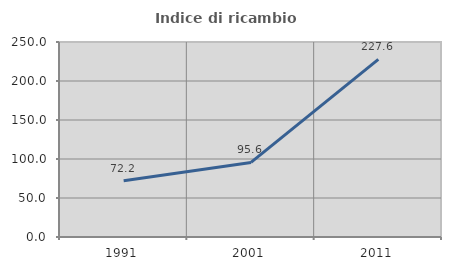
| Category | Indice di ricambio occupazionale  |
|---|---|
| 1991.0 | 72.183 |
| 2001.0 | 95.616 |
| 2011.0 | 227.619 |